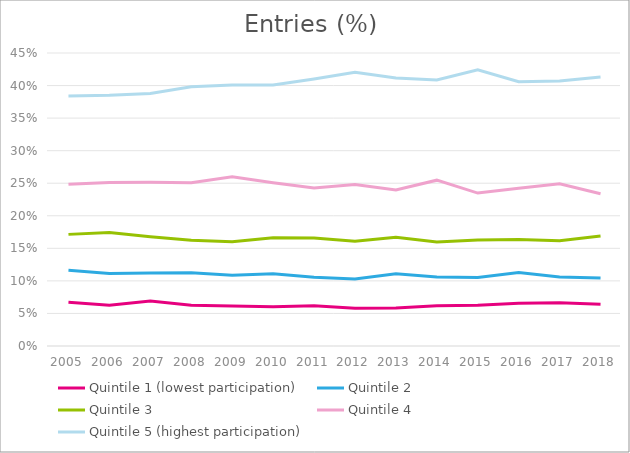
| Category | Quintile 1 (lowest participation) | Quintile 2 | Quintile 3 | Quintile 4 | Quintile 5 (highest participation) |
|---|---|---|---|---|---|
| 2005.0 | 0.067 | 0.116 | 0.171 | 0.248 | 0.384 |
| 2006.0 | 0.063 | 0.111 | 0.174 | 0.251 | 0.385 |
| 2007.0 | 0.069 | 0.112 | 0.168 | 0.251 | 0.388 |
| 2008.0 | 0.063 | 0.112 | 0.162 | 0.251 | 0.398 |
| 2009.0 | 0.061 | 0.108 | 0.16 | 0.26 | 0.401 |
| 2010.0 | 0.06 | 0.111 | 0.166 | 0.251 | 0.401 |
| 2011.0 | 0.062 | 0.106 | 0.166 | 0.243 | 0.41 |
| 2012.0 | 0.058 | 0.103 | 0.161 | 0.248 | 0.42 |
| 2013.0 | 0.058 | 0.111 | 0.167 | 0.24 | 0.412 |
| 2014.0 | 0.062 | 0.106 | 0.16 | 0.255 | 0.409 |
| 2015.0 | 0.063 | 0.105 | 0.163 | 0.235 | 0.424 |
| 2016.0 | 0.066 | 0.113 | 0.164 | 0.242 | 0.406 |
| 2017.0 | 0.067 | 0.106 | 0.162 | 0.249 | 0.407 |
| 2018.0 | 0.064 | 0.104 | 0.169 | 0.234 | 0.413 |